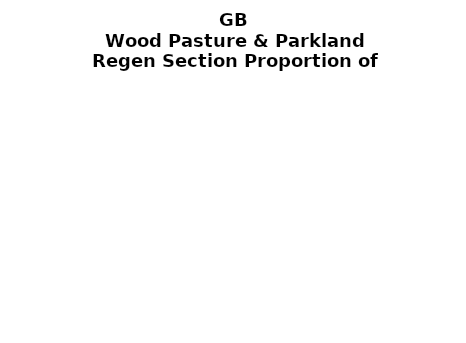
| Category | Wood Pasture & Parkland |
|---|---|
| None | 0.403 |
| Seedlings only | 0 |
| Seedlings, saplings only | 0.049 |
| Seedlings, saplings, <7 cm trees | 0.094 |
| Saplings only | 0.138 |
| <7 cm trees, seedlings only | 0 |
| <7 cm trees, saplings only | 0.232 |
| <7 cm Trees only | 0.084 |